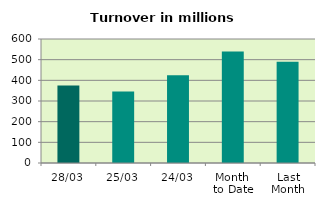
| Category | Series 0 |
|---|---|
| 28/03 | 375.274 |
| 25/03 | 345.815 |
| 24/03 | 424.942 |
| Month 
to Date | 539.195 |
| Last
Month | 490.433 |